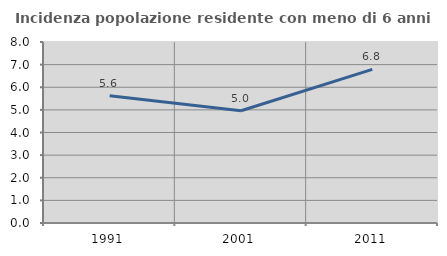
| Category | Incidenza popolazione residente con meno di 6 anni |
|---|---|
| 1991.0 | 5.627 |
| 2001.0 | 4.962 |
| 2011.0 | 6.792 |